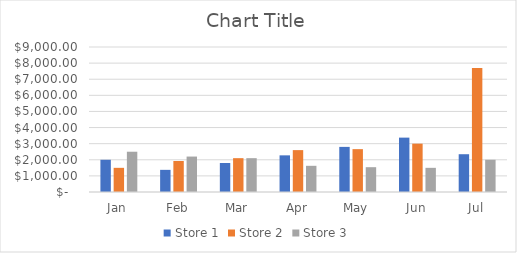
| Category | Store 1 | Store 2 | Store 3 |
|---|---|---|---|
| Jan | 2000 | 1500 | 2500 |
| Feb | 1375 | 1925 | 2200 |
| Mar | 1800 | 2100 | 2100 |
| Apr | 2275 | 2600 | 1625 |
| May | 2800 | 2660 | 1540 |
| Jun | 3375 | 3000 | 1500 |
| Jul | 2345 | 7689 | 2000 |